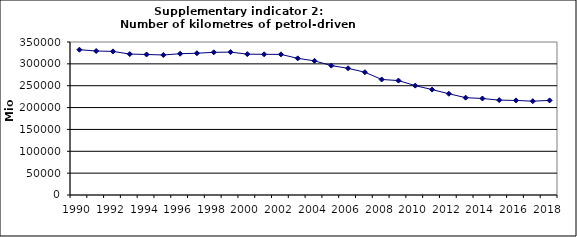
| Category | Number of kilometres of petrol-driven passenger cars, Mio km |
|---|---|
| 1990 | 332404.085 |
| 1991 | 329357.329 |
| 1992 | 328515.51 |
| 1993 | 322404.141 |
| 1994 | 321470.751 |
| 1995 | 320281.468 |
| 1996 | 323220.494 |
| 1997 | 324332.975 |
| 1998 | 326378.653 |
| 1999 | 326862.708 |
| 2000 | 322196.513 |
| 2001 | 321766.928 |
| 2002 | 321659.897 |
| 2003 | 312589.065 |
| 2004 | 306929.059 |
| 2005 | 295995.741 |
| 2006 | 289814.797 |
| 2007 | 280880.374 |
| 2008 | 264312.431 |
| 2009 | 261770.955 |
| 2010 | 250185.461 |
| 2011 | 241163.422 |
| 2012 | 231617.268 |
| 2013 | 222654.231 |
| 2014 | 220800.65 |
| 2015 | 217006.121 |
| 2016 | 216326.63 |
| 2017 | 214615.648 |
| 2018 | 216394.91 |